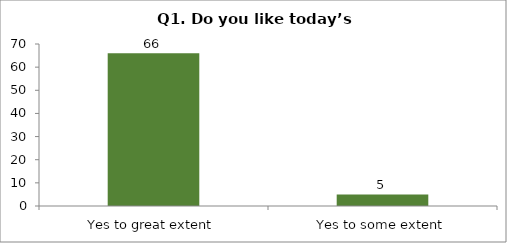
| Category | Q1. Do you like today’s session? |
|---|---|
| Yes to great extent | 66 |
| Yes to some extent | 5 |